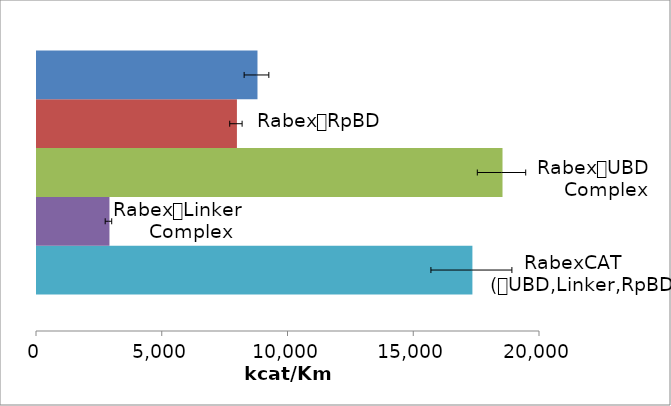
| Category | p281 | i139i87 | i137i87 | i141 | i78i87 yellow |
|---|---|---|---|---|---|
| 0 | 17312.333 | 2881 | 18509.333 | 7949.333 | 8766.667 |